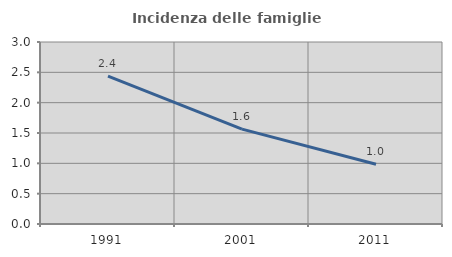
| Category | Incidenza delle famiglie numerose |
|---|---|
| 1991.0 | 2.437 |
| 2001.0 | 1.564 |
| 2011.0 | 0.984 |